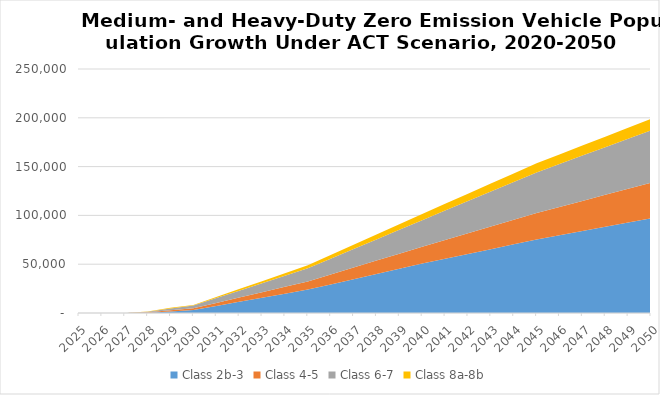
| Category | Class 2b-3 | Class 4-5 | Class 6-7 | Class 8a-8b |
|---|---|---|---|---|
| 2025.0 | 0 | 0 | 0 | 0 |
| 2026.0 | 0 | 0 | 0 | 0 |
| 2027.0 | 0 | 42.291 | 64.003 | 15.928 |
| 2028.0 | 352.363 | 397.9 | 642.954 | 161.33 |
| 2029.0 | 1554.293 | 1204.904 | 1964.049 | 648.412 |
| 2030.0 | 3030 | 1730 | 2850 | 560 |
| 2031.0 | 7218 | 3050 | 4978 | 1074 |
| 2032.0 | 11406 | 4370 | 7106 | 1588 |
| 2033.0 | 15594 | 5690 | 9234 | 2102 |
| 2034.0 | 19782 | 7010 | 11362 | 2616 |
| 2035.0 | 23970 | 8330 | 13490 | 3130 |
| 2036.0 | 29304 | 10124 | 16230 | 3770 |
| 2037.0 | 34638 | 11918 | 18970 | 4410 |
| 2038.0 | 39972 | 13712 | 21710 | 5050 |
| 2039.0 | 45306 | 15506 | 24450 | 5690 |
| 2040.0 | 50640 | 17300 | 27190 | 6330 |
| 2041.0 | 55572 | 19272 | 30060 | 6928 |
| 2042.0 | 60504 | 21244 | 32930 | 7526 |
| 2043.0 | 65436 | 23216 | 35800 | 8124 |
| 2044.0 | 70368 | 25188 | 38670 | 8722 |
| 2045.0 | 75300 | 27160 | 41540 | 9320 |
| 2046.0 | 79646 | 29010 | 43980 | 9802 |
| 2047.0 | 83992 | 30860 | 46420 | 10284 |
| 2048.0 | 88338 | 32710 | 48860 | 10766 |
| 2049.0 | 92684 | 34560 | 51300 | 11248 |
| 2050.0 | 97030 | 36410 | 53740 | 11730 |